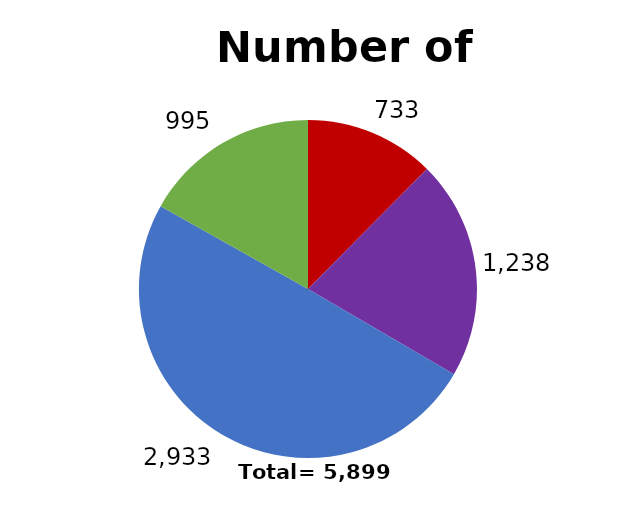
| Category | Series 0 |
|---|---|
| Biopharma core | 733 |
| Biopharma Service & Supply | 1238 |
| Med Tech core | 2933 |
| Med Tech Service & supply | 995 |